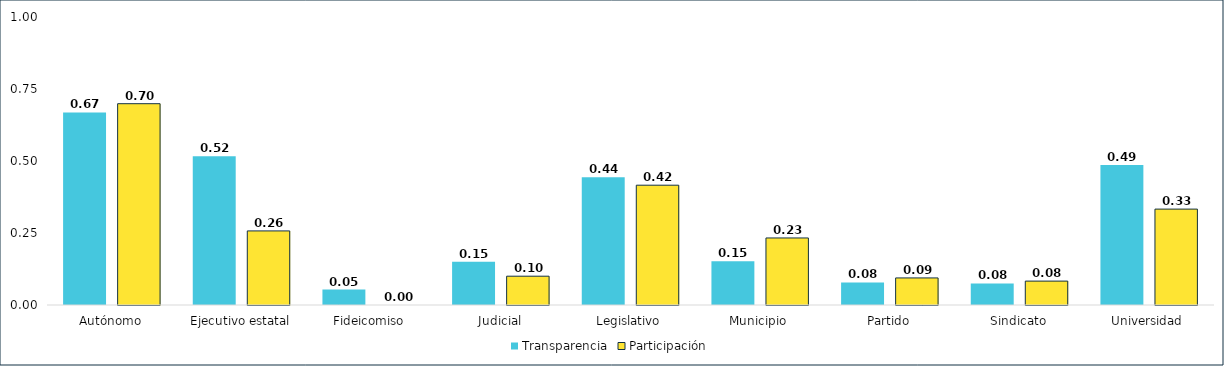
| Category | Transparencia | Participación |
|---|---|---|
| Autónomo | 0.669 | 0.699 |
| Ejecutivo estatal | 0.517 | 0.257 |
| Fideicomiso | 0.054 | 0 |
| Judicial | 0.15 | 0.1 |
| Legislativo | 0.443 | 0.416 |
| Municipio | 0.152 | 0.233 |
| Partido | 0.079 | 0.094 |
| Sindicato | 0.075 | 0.083 |
| Universidad | 0.486 | 0.333 |